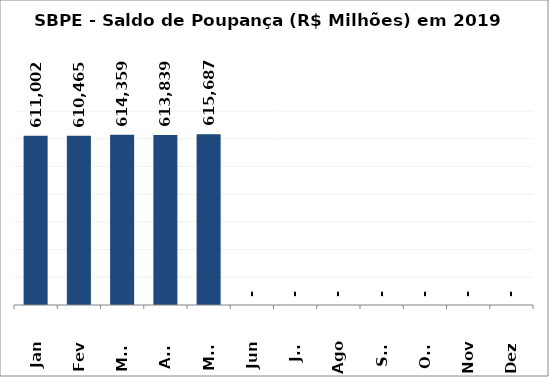
| Category | SBPE - Saldo de Poupança (R$ Milhões) em 2019 |
|---|---|
| Jan | 611001.78 |
| Fev | 610465.006 |
| Mar | 614358.561 |
| Abr | 613839.163 |
| Mai | 615687.332 |
| Jun | 0 |
| Jul | 0 |
| Ago | 0 |
| Set | 0 |
| Out | 0 |
| Nov | 0 |
| Dez | 0 |